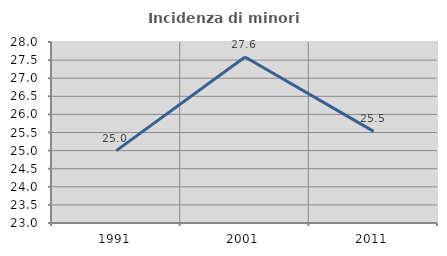
| Category | Incidenza di minori stranieri |
|---|---|
| 1991.0 | 25 |
| 2001.0 | 27.586 |
| 2011.0 | 25.532 |